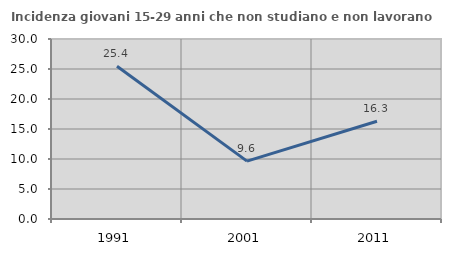
| Category | Incidenza giovani 15-29 anni che non studiano e non lavorano  |
|---|---|
| 1991.0 | 25.448 |
| 2001.0 | 9.644 |
| 2011.0 | 16.295 |